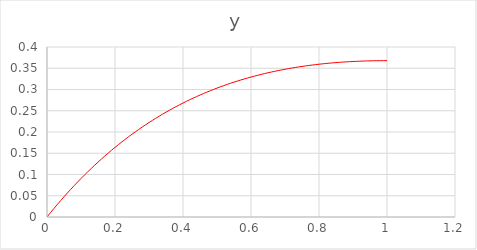
| Category | y |
|---|---|
| 0.0 | 0 |
| 0.01 | 0.01 |
| 0.02 | 0.02 |
| 0.03 | 0.029 |
| 0.04 | 0.038 |
| 0.05 | 0.048 |
| 0.060000000000000005 | 0.057 |
| 0.07 | 0.065 |
| 0.08 | 0.074 |
| 0.09 | 0.082 |
| 0.09999999999999999 | 0.09 |
| 0.10999999999999999 | 0.099 |
| 0.11999999999999998 | 0.106 |
| 0.12999999999999998 | 0.114 |
| 0.13999999999999999 | 0.122 |
| 0.15 | 0.129 |
| 0.16 | 0.136 |
| 0.17 | 0.143 |
| 0.18000000000000002 | 0.15 |
| 0.19000000000000003 | 0.157 |
| 0.20000000000000004 | 0.164 |
| 0.21000000000000005 | 0.17 |
| 0.22000000000000006 | 0.177 |
| 0.23000000000000007 | 0.183 |
| 0.24000000000000007 | 0.189 |
| 0.25000000000000006 | 0.195 |
| 0.26000000000000006 | 0.2 |
| 0.2700000000000001 | 0.206 |
| 0.2800000000000001 | 0.212 |
| 0.2900000000000001 | 0.217 |
| 0.3000000000000001 | 0.222 |
| 0.3100000000000001 | 0.227 |
| 0.3200000000000001 | 0.232 |
| 0.3300000000000001 | 0.237 |
| 0.34000000000000014 | 0.242 |
| 0.35000000000000014 | 0.247 |
| 0.36000000000000015 | 0.251 |
| 0.37000000000000016 | 0.256 |
| 0.38000000000000017 | 0.26 |
| 0.3900000000000002 | 0.264 |
| 0.4000000000000002 | 0.268 |
| 0.4100000000000002 | 0.272 |
| 0.4200000000000002 | 0.276 |
| 0.4300000000000002 | 0.28 |
| 0.4400000000000002 | 0.283 |
| 0.45000000000000023 | 0.287 |
| 0.46000000000000024 | 0.29 |
| 0.47000000000000025 | 0.294 |
| 0.48000000000000026 | 0.297 |
| 0.49000000000000027 | 0.3 |
| 0.5000000000000002 | 0.303 |
| 0.5100000000000002 | 0.306 |
| 0.5200000000000002 | 0.309 |
| 0.5300000000000002 | 0.312 |
| 0.5400000000000003 | 0.315 |
| 0.5500000000000003 | 0.317 |
| 0.5600000000000003 | 0.32 |
| 0.5700000000000003 | 0.322 |
| 0.5800000000000003 | 0.325 |
| 0.5900000000000003 | 0.327 |
| 0.6000000000000003 | 0.329 |
| 0.6100000000000003 | 0.331 |
| 0.6200000000000003 | 0.334 |
| 0.6300000000000003 | 0.336 |
| 0.6400000000000003 | 0.337 |
| 0.6500000000000004 | 0.339 |
| 0.6600000000000004 | 0.341 |
| 0.6700000000000004 | 0.343 |
| 0.6800000000000004 | 0.344 |
| 0.6900000000000004 | 0.346 |
| 0.7000000000000004 | 0.348 |
| 0.7100000000000004 | 0.349 |
| 0.7200000000000004 | 0.35 |
| 0.7300000000000004 | 0.352 |
| 0.7400000000000004 | 0.353 |
| 0.7500000000000004 | 0.354 |
| 0.7600000000000005 | 0.355 |
| 0.7700000000000005 | 0.357 |
| 0.7800000000000005 | 0.358 |
| 0.7900000000000005 | 0.359 |
| 0.8000000000000005 | 0.359 |
| 0.8100000000000005 | 0.36 |
| 0.8200000000000005 | 0.361 |
| 0.8300000000000005 | 0.362 |
| 0.8400000000000005 | 0.363 |
| 0.8500000000000005 | 0.363 |
| 0.8600000000000005 | 0.364 |
| 0.8700000000000006 | 0.364 |
| 0.8800000000000006 | 0.365 |
| 0.8900000000000006 | 0.365 |
| 0.9000000000000006 | 0.366 |
| 0.9100000000000006 | 0.366 |
| 0.9200000000000006 | 0.367 |
| 0.9300000000000006 | 0.367 |
| 0.9400000000000006 | 0.367 |
| 0.9500000000000006 | 0.367 |
| 0.9600000000000006 | 0.368 |
| 0.9700000000000006 | 0.368 |
| 0.9800000000000006 | 0.368 |
| 0.9900000000000007 | 0.368 |
| 1.0000000000000007 | 0.368 |